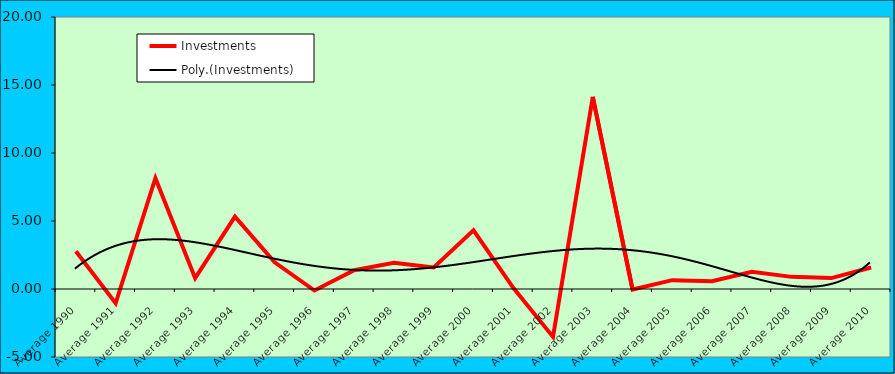
| Category | Investments |
|---|---|
| Average 1990 | 2.78 |
| Average 1991 | -1.046 |
| Average 1992 | 8.147 |
| Average 1993 | 0.8 |
| Average 1994 | 5.317 |
| Average 1995 | 1.962 |
| Average 1996 | -0.112 |
| Average 1997 | 1.382 |
| Average 1998 | 1.927 |
| Average 1999 | 1.584 |
| Average 2000 | 4.311 |
| Average 2001 | 0.087 |
| Average 2002 | -3.521 |
| Average 2003 | 14.131 |
| Average 2004 | -0.035 |
| Average 2005 | 0.651 |
| Average 2006 | 0.577 |
| Average 2007 | 1.263 |
| Average 2008 | 0.892 |
| Average 2009 | 0.802 |
| Average 2010 | 1.577 |